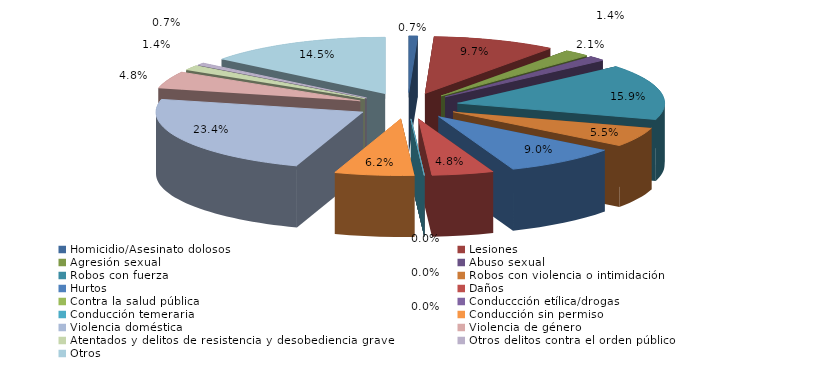
| Category | Series 0 |
|---|---|
| Homicidio/Asesinato dolosos | 1 |
| Lesiones | 14 |
| Agresión sexual | 3 |
| Abuso sexual | 2 |
| Robos con fuerza | 23 |
| Robos con violencia o intimidación | 8 |
| Hurtos | 13 |
| Daños | 7 |
| Contra la salud pública | 0 |
| Conduccción etílica/drogas | 0 |
| Conducción temeraria | 0 |
| Conducción sin permiso | 9 |
| Violencia doméstica | 34 |
| Violencia de género | 7 |
| Atentados y delitos de resistencia y desobediencia grave | 2 |
| Otros delitos contra el orden público | 1 |
| Otros | 21 |